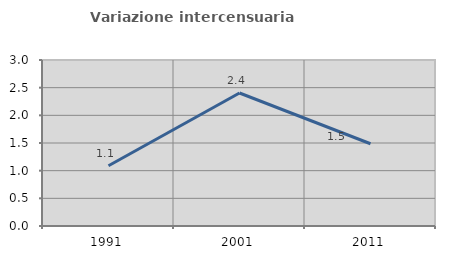
| Category | Variazione intercensuaria annua |
|---|---|
| 1991.0 | 1.088 |
| 2001.0 | 2.403 |
| 2011.0 | 1.487 |